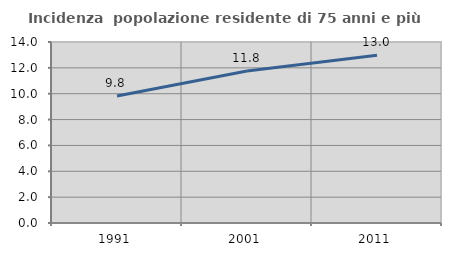
| Category | Incidenza  popolazione residente di 75 anni e più |
|---|---|
| 1991.0 | 9.819 |
| 2001.0 | 11.753 |
| 2011.0 | 12.973 |